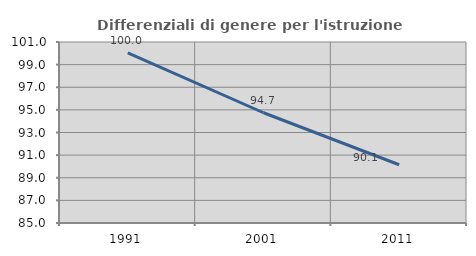
| Category | Differenziali di genere per l'istruzione superiore |
|---|---|
| 1991.0 | 100.037 |
| 2001.0 | 94.746 |
| 2011.0 | 90.148 |